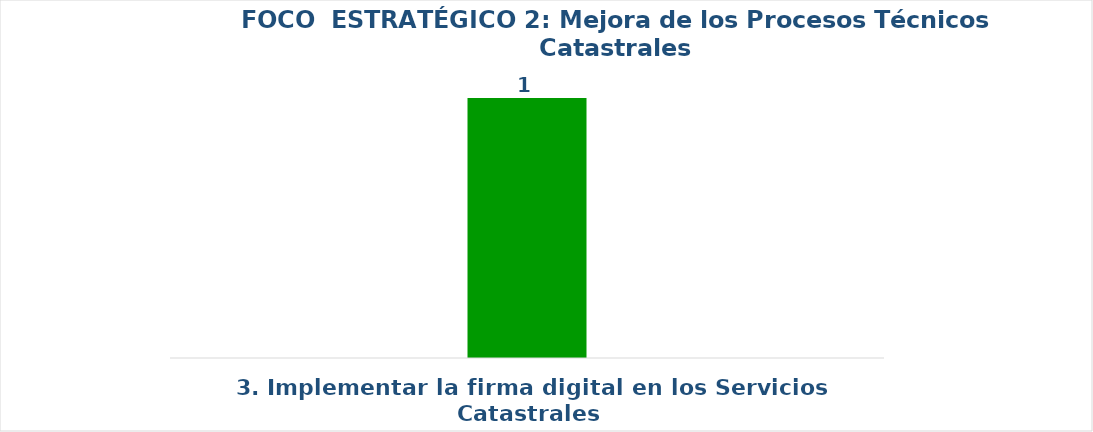
| Category | Series 0 |
|---|---|
| 3. Implementar la firma digital en los Servicios Catastrales | 1 |